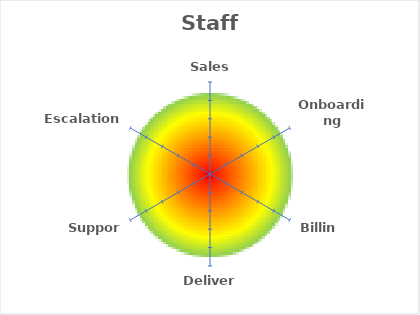
| Category | Staff Experience |
|---|---|
| Sales | 0 |
| Onboarding | 0 |
| Billing | 0 |
| Delivery | 0 |
| Support | 0 |
| Escalations | 0 |